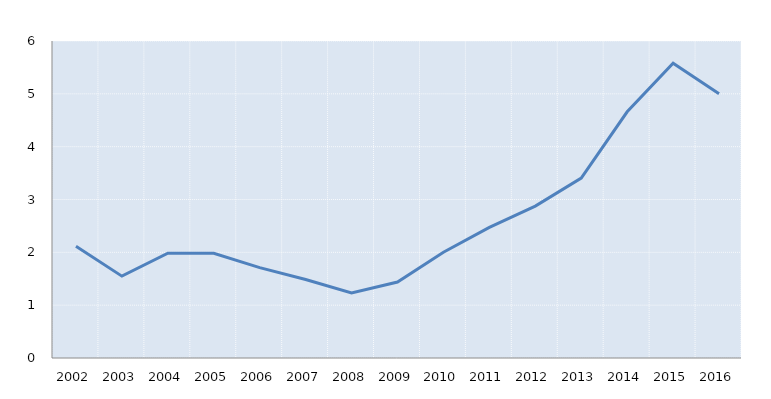
| Category | Series 0 |
|---|---|
| 2002.0 | 2.117 |
| 2003.0 | 1.549 |
| 2004.0 | 1.984 |
| 2005.0 | 1.982 |
| 2006.0 | 1.711 |
| 2007.0 | 1.485 |
| 2008.0 | 1.233 |
| 2009.0 | 1.438 |
| 2010.0 | 2.002 |
| 2011.0 | 2.471 |
| 2012.0 | 2.874 |
| 2013.0 | 3.406 |
| 2014.0 | 4.66 |
| 2015.0 | 5.578 |
| 2016.0 | 5 |